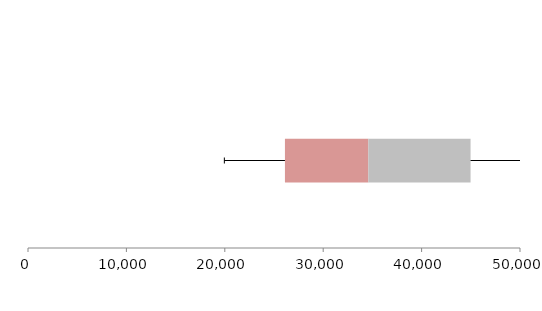
| Category | Series 1 | Series 2 | Series 3 |
|---|---|---|---|
| 0 | 26112.151 | 8474.276 | 10388.741 |